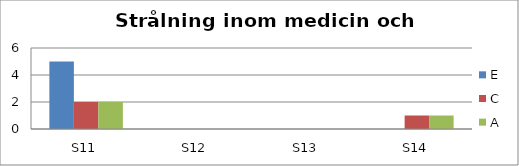
| Category | E | C | A |
|---|---|---|---|
| S11 | 5 | 2 | 2 |
| S12 | 0 | 0 | 0 |
| S13 | 0 | 0 | 0 |
| S14 | 0 | 1 | 1 |